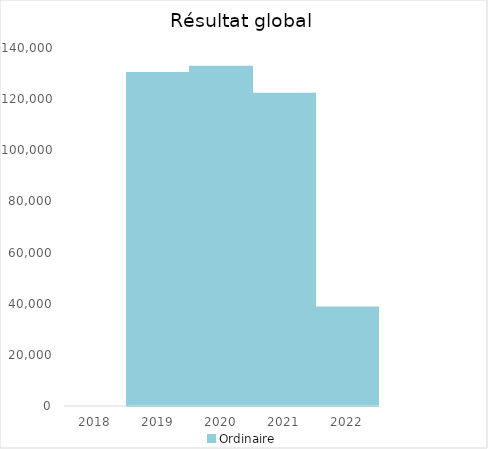
| Category |   | Ordinaire |    |
|---|---|---|---|
| 2018.0 |  | 0 |  |
| 2019.0 |  | 130267.86 |  |
| 2020.0 |  | 132645.21 |  |
| 2021.0 |  | 122132.84 |  |
| 2022.0 |  | 38490.93 |  |